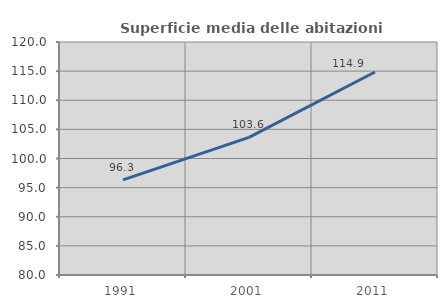
| Category | Superficie media delle abitazioni occupate |
|---|---|
| 1991.0 | 96.319 |
| 2001.0 | 103.632 |
| 2011.0 | 114.857 |